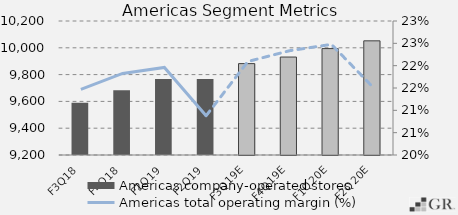
| Category | Americas company-operated stores |
|---|---|
|  F3Q18  | 9590 |
|  F4Q18  | 9684 |
|  F1Q19  | 9768 |
|  F2Q19  | 9767 |
|  F3Q19E  | 9882 |
|  F4Q19E  | 9931 |
|  F1Q20E  | 9994 |
|  F2Q20E  | 10052 |